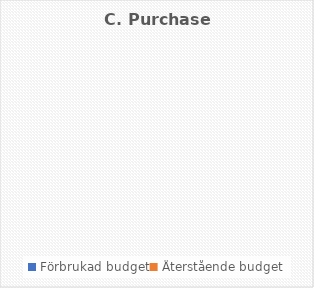
| Category | C. Purchase costs |
|---|---|
| Förbrukad budget | 0 |
| Återstående budget | 0 |